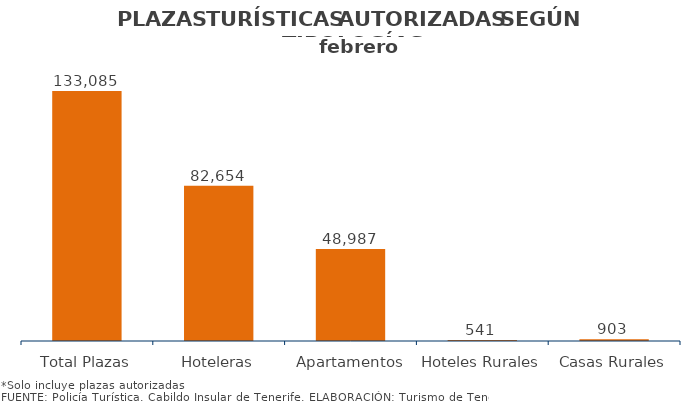
| Category | PLAZAS TURISTICAS AUTORIZADAS SEGÚN TIPOLOGÍA DEL ESTABLECIMIENTO.
Municipios e Isla febrero 2014 |
|---|---|
| Total Plazas | 133085 |
| Hoteleras | 82654 |
| Apartamentos | 48987 |
| Hoteles Rurales | 541 |
| Casas Rurales | 903 |